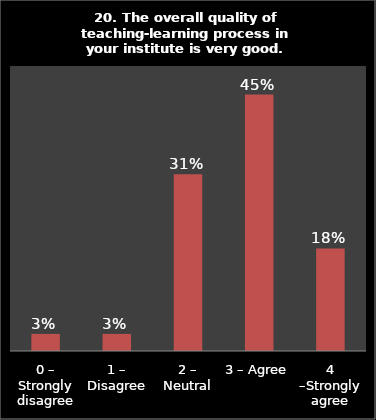
| Category | Series 0 |
|---|---|
| 0 – Strongly disagree | 0.03 |
| 1 – Disagree | 0.03 |
| 2 – Neutral | 0.31 |
| 3 – Agree | 0.45 |
| 4 –Strongly agree | 0.18 |